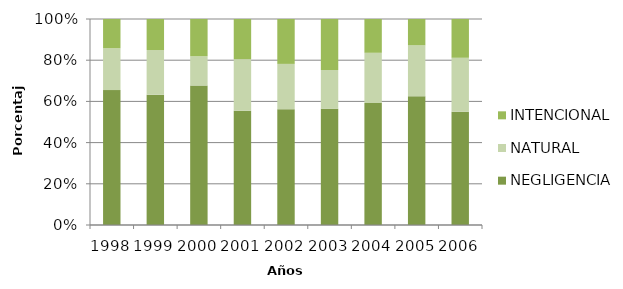
| Category | NEGLIGENCIA | NATURAL | INTENCIONAL |
|---|---|---|---|
| 1998.0 | 2693 | 836 | 583 |
| 1999.0 | 1874 | 642 | 447 |
| 2000.0 | 895 | 188 | 239 |
| 2001.0 | 682 | 308 | 240 |
| 2002.0 | 1197 | 468 | 464 |
| 2003.0 | 1540 | 515 | 676 |
| 2004.0 | 751 | 309 | 208 |
| 2005.0 | 1382 | 547 | 282 |
| 2006.0 | 634 | 302 | 217 |